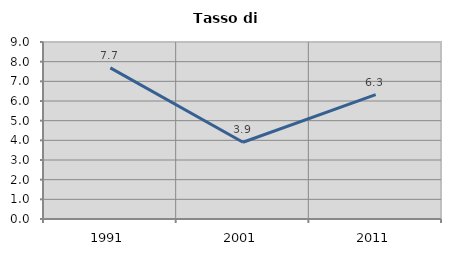
| Category | Tasso di disoccupazione   |
|---|---|
| 1991.0 | 7.687 |
| 2001.0 | 3.904 |
| 2011.0 | 6.327 |